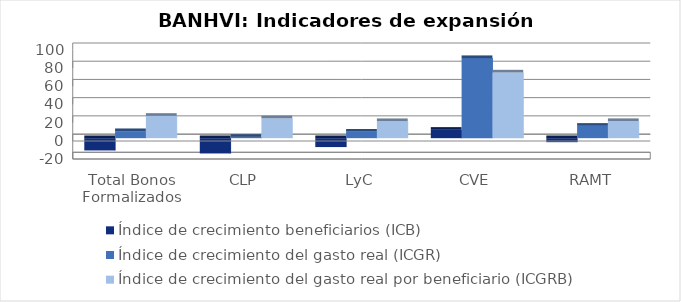
| Category | Índice de crecimiento beneficiarios (ICB)  | Índice de crecimiento del gasto real (ICGR)  | Índice de crecimiento del gasto real por beneficiario (ICGRB)  |
|---|---|---|---|
| Total Bonos Formalizados | -13.48 | 7.713 | 24.494 |
| CLP | -16.781 | 1.412 | 21.861 |
| LyC | -9.759 | 7.141 | 18.728 |
| CVE | 9.184 | 87.921 | 72.115 |
| RAMT | -4.386 | 13.57 | 18.779 |